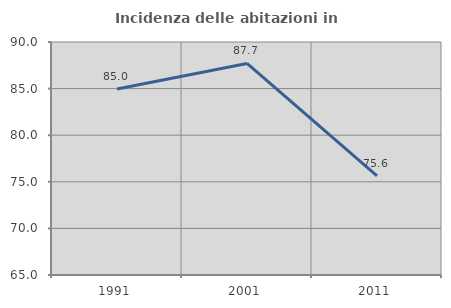
| Category | Incidenza delle abitazioni in proprietà  |
|---|---|
| 1991.0 | 84.961 |
| 2001.0 | 87.695 |
| 2011.0 | 75.647 |